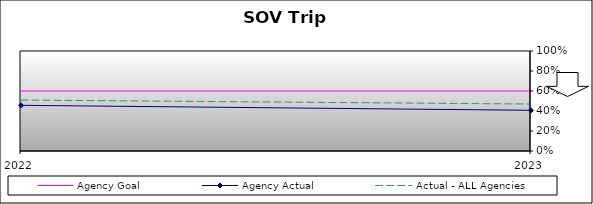
| Category | Agency Goal | Agency Actual | Actual - ALL Agencies |
|---|---|---|---|
| 2022.0 | 0.6 | 0.457 | 0.509 |
| 2023.0 | 0.6 | 0.407 | 0.47 |